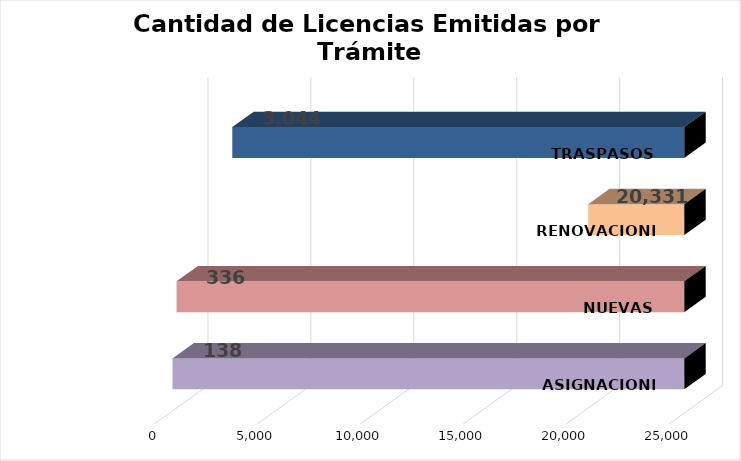
| Category | Series 0 |
|---|---|
| ASIGNACIONES | 138 |
| NUEVAS | 336 |
| RENOVACIONES | 20331 |
| TRASPASOS | 3044 |